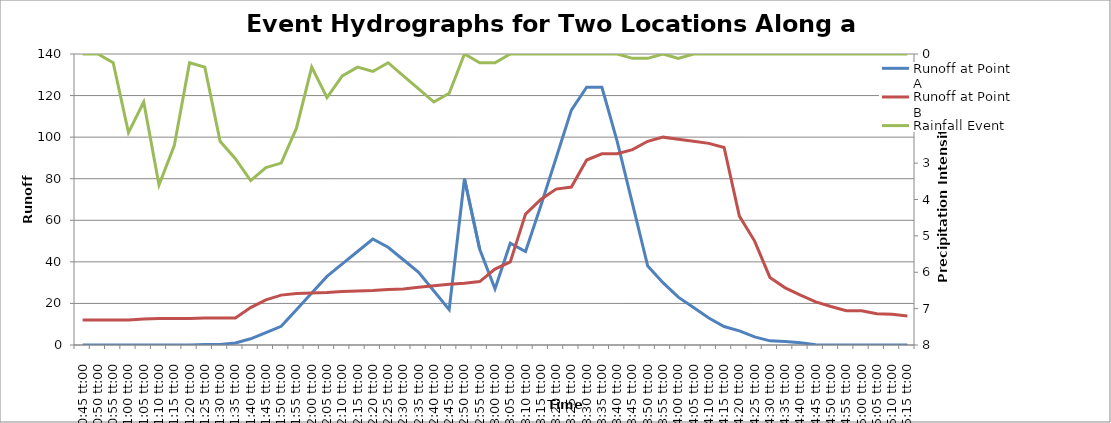
| Category | Runoff at Point A | Runoff at Point B |
|---|---|---|
| 0.4479166666666667 | 0 | 12 |
| 0.4513888888888889 | 0 | 12 |
| 0.454861111111111 | 0 | 12 |
| 0.458333333333333 | 0 | 12 |
| 0.461805555555555 | 0 | 12.5 |
| 0.465277777777778 | 0 | 12.75 |
| 0.46875 | 0 | 12.75 |
| 0.472222222222222 | 0 | 12.75 |
| 0.475694444444444 | 0.2 | 13 |
| 0.479166666666667 | 0.3 | 13 |
| 0.482638888888889 | 1 | 13 |
| 0.486111111111111 | 3 | 18 |
| 0.489583333333333 | 6 | 21.75 |
| 0.493055555555555 | 9 | 24 |
| 0.496527777777778 | 17 | 24.75 |
| 0.5 | 25 | 25 |
| 0.503472222222222 | 33 | 25.25 |
| 0.506944444444444 | 39 | 25.75 |
| 0.510416666666667 | 45 | 26 |
| 0.513888888888889 | 51 | 26.25 |
| 0.517361111111111 | 47 | 26.75 |
| 0.520833333333333 | 41 | 27 |
| 0.524305555555555 | 35 | 27.75 |
| 0.527777777777777 | 26 | 28.5 |
| 0.53125 | 17 | 29.25 |
| 0.534722222222222 | 80 | 29.75 |
| 0.538194444444444 | 46 | 30.5 |
| 0.541666666666666 | 27 | 36.5 |
| 0.545138888888889 | 49 | 40 |
| 0.548611111111111 | 45 | 63 |
| 0.552083333333333 | 67 | 70 |
| 0.555555555555556 | 90 | 75 |
| 0.559027777777778 | 113 | 76 |
| 0.5625 | 124 | 89 |
| 0.565972222222222 | 124 | 92 |
| 0.569444444444444 | 98 | 92 |
| 0.572916666666667 | 68 | 94 |
| 0.576388888888889 | 38 | 98 |
| 0.579861111111111 | 30 | 100 |
| 0.583333333333333 | 23 | 99 |
| 0.586805555555555 | 18 | 98 |
| 0.590277777777778 | 13 | 97 |
| 0.59375 | 8.9 | 95 |
| 0.597222222222222 | 6.8 | 62 |
| 0.600694444444444 | 3.9 | 50 |
| 0.604166666666666 | 2 | 32.5 |
| 0.607638888888888 | 1.7 | 27.5 |
| 0.61111111111111 | 1.1 | 24 |
| 0.614583333333332 | 0.09 | 20.75 |
| 0.618055555555554 | 0.05 | 18.5 |
| 0.621527777777776 | 0 | 16.5 |
| 0.624999999999998 | 0 | 16.5 |
| 0.628472222222221 | 0 | 15 |
| 0.631944444444443 | 0 | 14.75 |
| 0.635416666666665 | 0 | 14 |